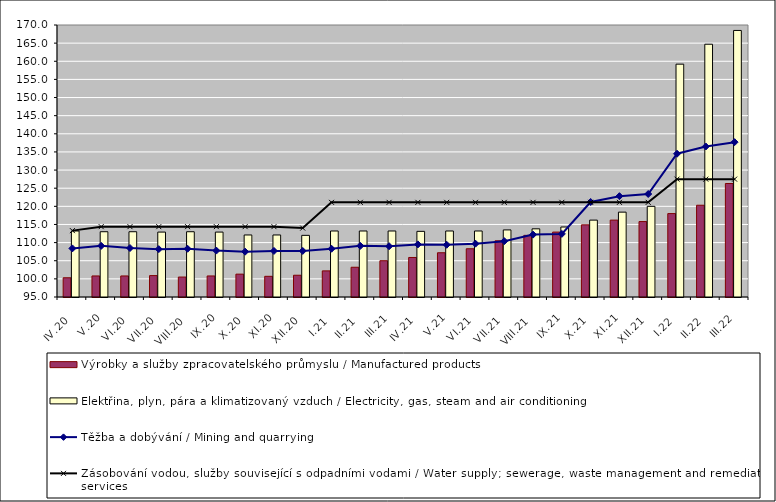
| Category | Výrobky a služby zpracovatelského průmyslu / Manufactured products | Elektřina, plyn, pára a klimatizovaný vzduch / Electricity, gas, steam and air conditioning |
|---|---|---|
| IV.20 | 100.3 | 113.2 |
| V.20 | 100.8 | 113 |
| VI.20 | 100.8 | 113 |
| VII.20 | 100.9 | 112.9 |
| VIII.20 | 100.5 | 113 |
| IX.20 | 100.8 | 112.9 |
| X.20 | 101.3 | 112.1 |
| XI.20 | 100.7 | 112.1 |
| XII.20 | 101 | 112 |
| I.21 | 102.2 | 113.2 |
| II.21 | 103.2 | 113.2 |
| III.21 | 105 | 113.2 |
| IV.21 | 105.9 | 113.1 |
| V.21 | 107.2 | 113.2 |
| VI.21 | 108.3 | 113.2 |
| VII.21 | 110.5 | 113.5 |
| VIII.21 | 112 | 113.8 |
| IX.21 | 112.9 | 114.3 |
| X.21 | 114.9 | 116.2 |
| XI.21 | 116.2 | 118.4 |
| XII.21 | 115.8 | 120 |
| I.22 | 118 | 159.2 |
| II.22 | 120.3 | 164.7 |
| III.22 | 126.3 | 168.5 |